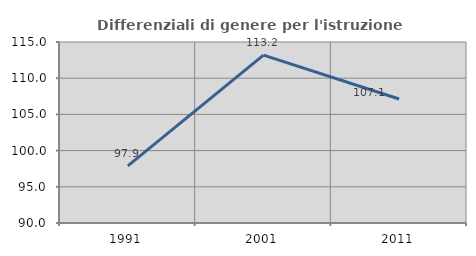
| Category | Differenziali di genere per l'istruzione superiore |
|---|---|
| 1991.0 | 97.896 |
| 2001.0 | 113.186 |
| 2011.0 | 107.123 |